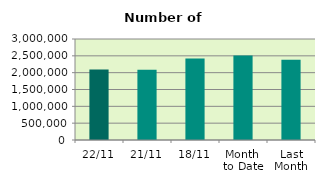
| Category | Series 0 |
|---|---|
| 22/11 | 2091006 |
| 21/11 | 2083926 |
| 18/11 | 2423006 |
| Month 
to Date | 2511264.5 |
| Last
Month | 2382963.143 |